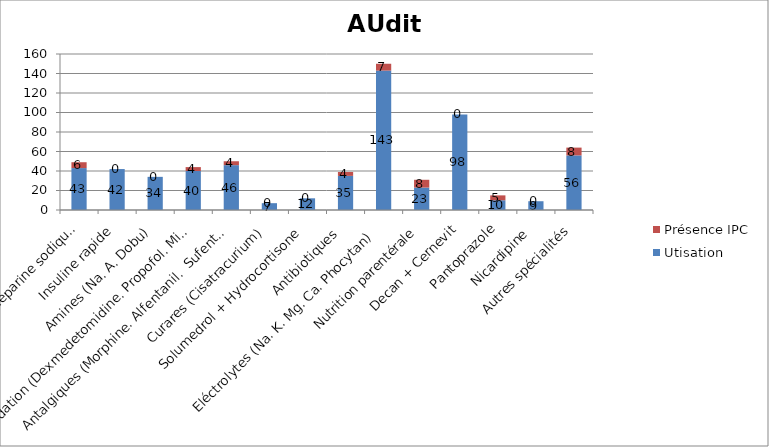
| Category | Utisation | Présence IPC |
|---|---|---|
| Héparine sodique  | 43 | 6 |
| Insuline rapide | 42 | 0 |
| Amines (Na. A. Dobu) | 34 | 0 |
| Sédation (Dexmedetomidine. Propofol. Midazolam) | 40 | 4 |
| Antalgiques (Morphine. Alfentanil.  Sufentanyl. Rémifentanyl. Nefopam) | 46 | 4 |
| Curares (Cisatracurium) | 7 | 0 |
| Solumedrol + Hydrocortisone | 12 | 0 |
| Antibiotiques  | 35 | 4 |
| Eléctrolytes (Na. K. Mg. Ca. Phocytan)  | 143 | 7 |
| Nutrition parentérale | 23 | 8 |
| Decan + Cernevit | 98 | 0 |
| Pantoprazole | 10 | 5 |
| Nicardipine  | 9 | 0 |
| Autres spécialités | 56 | 8 |